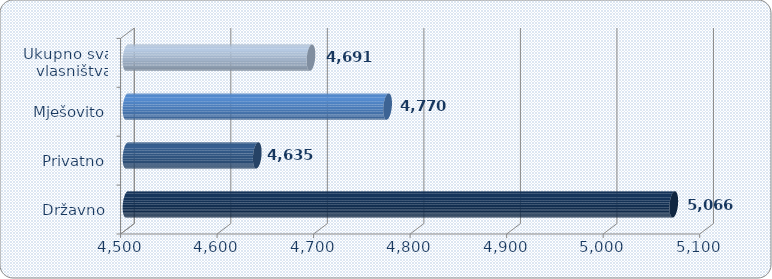
| Category | Prosječna mjesečna neto plaća po zaposlenom |
|---|---|
| Državno | 5066.462 |
| Privatno | 4634.956 |
| Mješovito | 4769.991 |
| Ukupno sva
 vlasništva | 4690.601 |